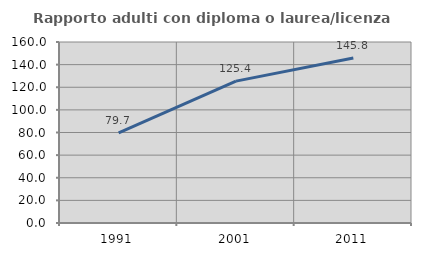
| Category | Rapporto adulti con diploma o laurea/licenza media  |
|---|---|
| 1991.0 | 79.71 |
| 2001.0 | 125.397 |
| 2011.0 | 145.843 |